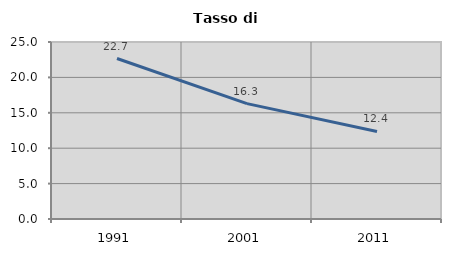
| Category | Tasso di disoccupazione   |
|---|---|
| 1991.0 | 22.664 |
| 2001.0 | 16.298 |
| 2011.0 | 12.361 |